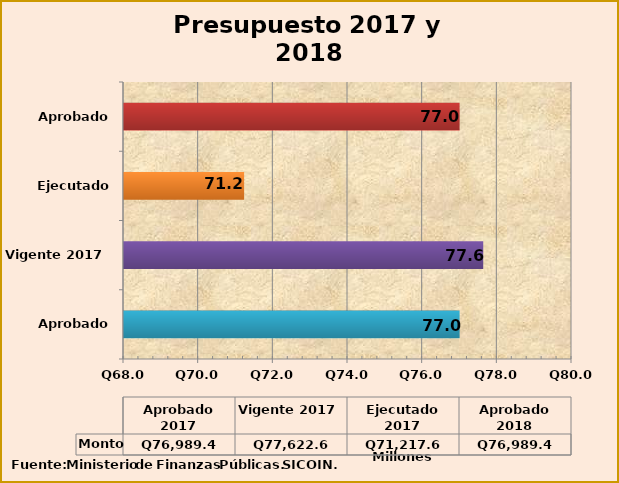
| Category | Monto |
|---|---|
| Aprobado 2017 | 76989.4 |
| Vigente 2017 | 77622.6 |
| Ejecutado 2017 | 71217.6 |
| Aprobado 2018 | 76989.4 |